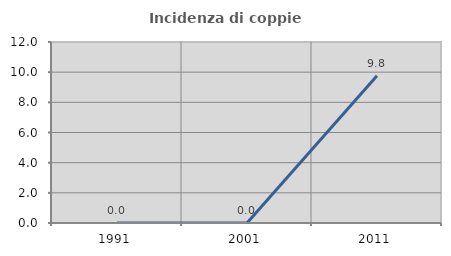
| Category | Incidenza di coppie miste |
|---|---|
| 1991.0 | 0 |
| 2001.0 | 0 |
| 2011.0 | 9.756 |